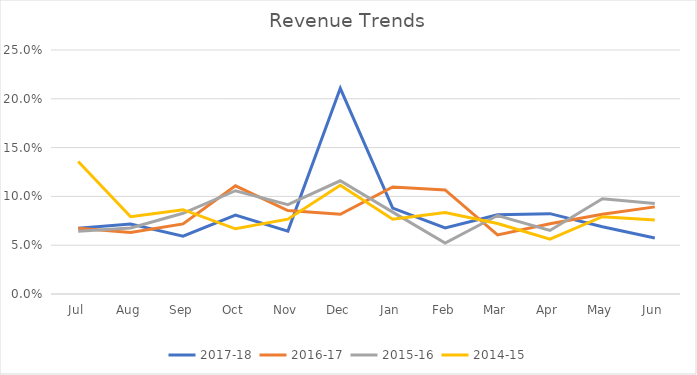
| Category | 2017-18 | 2016-17 | 2015-16 | 2014-15 |
|---|---|---|---|---|
| Jul | 0.067 | 0.067 | 0.064 | 0.136 |
| Aug | 0.072 | 0.063 | 0.068 | 0.079 |
| Sep | 0.059 | 0.072 | 0.083 | 0.086 |
| Oct | 0.081 | 0.111 | 0.106 | 0.067 |
| Nov | 0.064 | 0.086 | 0.092 | 0.077 |
| Dec | 0.211 | 0.082 | 0.116 | 0.111 |
| Jan | 0.088 | 0.11 | 0.084 | 0.077 |
| Feb | 0.068 | 0.107 | 0.052 | 0.084 |
| Mar | 0.081 | 0.061 | 0.08 | 0.072 |
| Apr | 0.082 | 0.072 | 0.065 | 0.056 |
| May | 0.069 | 0.082 | 0.098 | 0.079 |
| Jun | 0.057 | 0.089 | 0.093 | 0.076 |